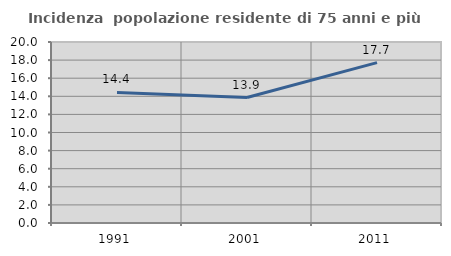
| Category | Incidenza  popolazione residente di 75 anni e più |
|---|---|
| 1991.0 | 14.433 |
| 2001.0 | 13.861 |
| 2011.0 | 17.722 |